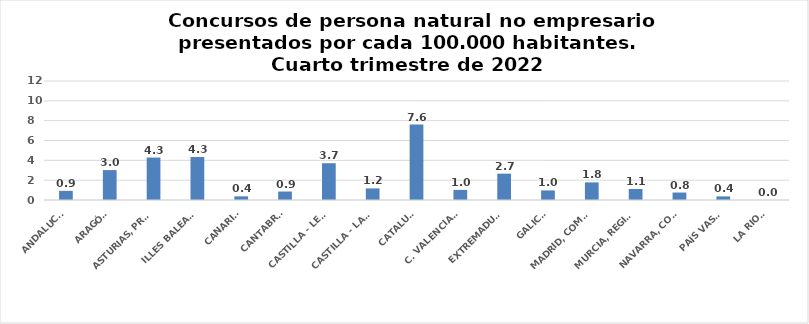
| Category | Series 0 |
|---|---|
| ANDALUCÍA | 0.923 |
| ARAGÓN | 3.016 |
| ASTURIAS, PRINCIPADO | 4.28 |
| ILLES BALEARS | 4.334 |
| CANARIAS | 0.367 |
| CANTABRIA | 0.854 |
| CASTILLA - LEÓN | 3.709 |
| CASTILLA - LA MANCHA | 1.169 |
| CATALUÑA | 7.61 |
| C. VALENCIANA | 1.02 |
| EXTREMADURA | 2.655 |
| GALICIA | 0.966 |
| MADRID, COMUNIDAD | 1.778 |
| MURCIA, REGIÓN | 1.11 |
| NAVARRA, COM. FORAL | 0.753 |
| PAÍS VASCO | 0.362 |
| LA RIOJA | 0 |